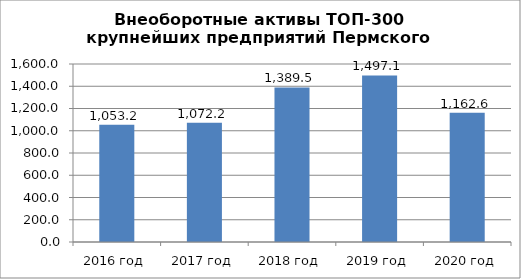
| Category | Внеоборотные активы |
|---|---|
| 2016 год | 1053.2 |
| 2017 год | 1072.2 |
| 2018 год | 1389.5 |
| 2019 год | 1497.1 |
| 2020 год | 1162.6 |